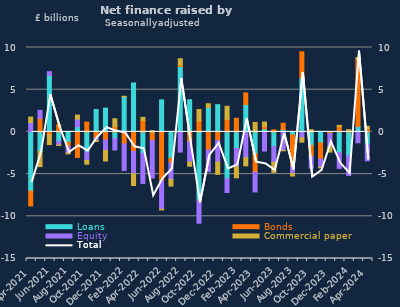
| Category | Loans | Bonds | Equity | Commercial paper |
|---|---|---|---|---|
| Apr-2021 | -7.013 | -1.754 | 1.114 | 0.65 |
| May-2021 | -2.298 | 1.596 | 0.961 | -1.817 |
| Jun-2021 | 6.682 | -0.338 | 0.455 | -1.166 |
| Jul-2021 | -1.107 | 0.867 | -0.44 | -0.072 |
| Aug-2021 | -1.228 | -0.499 | -0.744 | -0.136 |
| Sep-2021 | 0.609 | -3.026 | 0.906 | 0.481 |
| Oct-2021 | -2.379 | 1.158 | -1.001 | -0.446 |
| Nov-2021 | 2.654 | -0.729 | -0.299 | -0.107 |
| Dec-2021 | 2.823 | -0.957 | -1.234 | -1.25 |
| Jan-2022 | -0.783 | 0.598 | -1.363 | 0.961 |
| Feb-2022 | 4.161 | -1.431 | -3.138 | 0.058 |
| Mar-2022 | 5.803 | -2.323 | -2.629 | -1.403 |
| Apr-2022 | -2.534 | 1.362 | -3.569 | 0.359 |
| May-2022 | -0.097 | -0.942 | -4.428 | 0.142 |
| Jun-2022 | 3.8 | -5.816 | -3.351 | -0.081 |
| Jul-2022 | -3.13 | -0.555 | -1.946 | -0.789 |
| Aug-2022 | 7.755 | 0.173 | -2.389 | 0.742 |
| Sep-2022 | 3.811 | -1.135 | -2.442 | -0.495 |
| Oct-2022 | -8.058 | 1.304 | -2.762 | 1.347 |
| Nov-2022 | 2.878 | -2.15 | -2.55 | 0.46 |
| Dec-2022 | 3.23 | -1.032 | -2.549 | -1.457 |
| Jan-2023 | -5.549 | 1.488 | -1.629 | 1.544 |
| Feb-2023 | -1.971 | 1.616 | -2.162 | -1.306 |
| Mar-2023 | 3.243 | 1.375 | -3.046 | -0.973 |
| Apr-2023 | -2.563 | -2.212 | -2.337 | 1.122 |
| May-2023 | 0.367 | 0.298 | -2.271 | 0.503 |
| Jun-2023 | -1.736 | 0.244 | -1.863 | -1.198 |
| Jul-2023 | 0.27 | 0.754 | -2.186 | -0.052 |
| Aug-2023 | -0.352 | -3.733 | -0.831 | -0.312 |
| Sep-2023 | 6.384 | 3.109 | -0.701 | -0.512 |
| Oct-2023 | -1.605 | -1.306 | -1.372 | 0.267 |
| Nov-2023 | -1.295 | -1.935 | -0.961 | -0.066 |
| Dec-2023 | -0.046 | -0.156 | -1.537 | -0.653 |
| Jan-2024 | -2.471 | 0.609 | -1.858 | 0.167 |
| Feb-2024 | -2.83 | 0.021 | -2.333 | 0.241 |
| Mar-2024 | 0.638 | 7.96 | -1.288 | 0.208 |
| Apr-2024 | -1.47 | 0.348 | -1.958 | 0.315 |